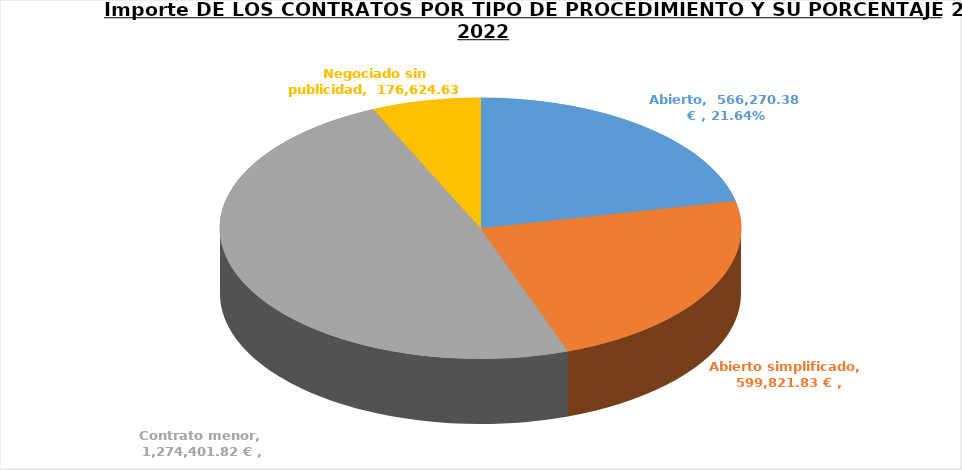
| Category | Suma de Importe sin Impuestos | PORCENTAJE POR IMPORTES |
|---|---|---|
| Abierto | 566270.38 | 0.216 |
| Abierto simplificado | 599821.83 | 0.229 |
| Contrato menor | 1274401.823 | 0.487 |
| Negociado sin publicidad | 176624.627 | 0.067 |